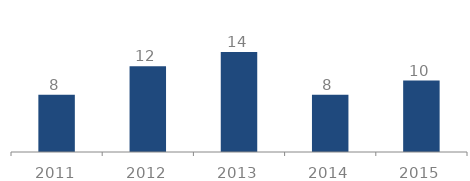
| Category | Profit |
|---|---|
| 2011 | 8 |
| 2012 | 12 |
| 2013 | 14 |
| 2014 | 8 |
| 2015 | 10 |